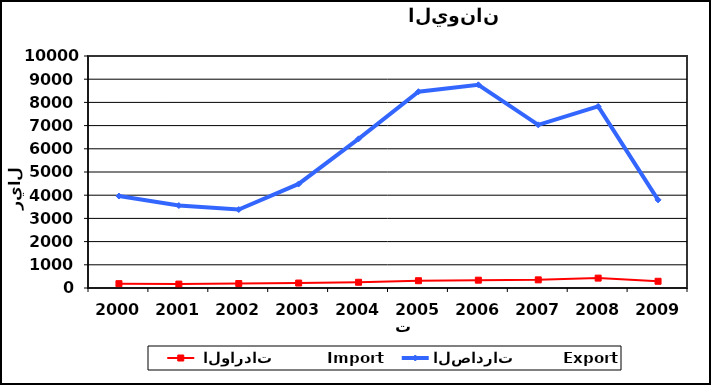
| Category |  الواردات           Import | الصادرات          Export |
|---|---|---|
| 2000.0 | 187 | 3964 |
| 2001.0 | 168 | 3554 |
| 2002.0 | 193 | 3382 |
| 2003.0 | 213 | 4485 |
| 2004.0 | 247 | 6430 |
| 2005.0 | 314 | 8461 |
| 2006.0 | 337 | 8758 |
| 2007.0 | 351 | 7032 |
| 2008.0 | 426 | 7827 |
| 2009.0 | 290 | 3799 |